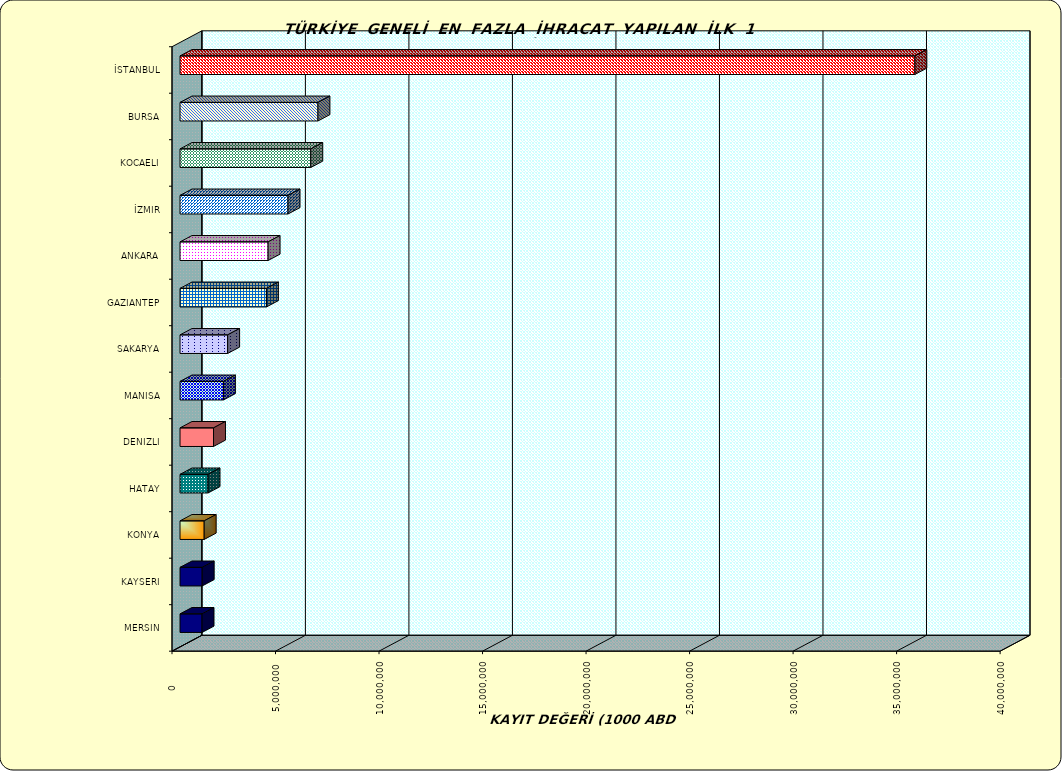
| Category | Series 0 |
|---|---|
| İSTANBUL | 35494831.676 |
| BURSA | 6662457.967 |
| KOCAELI | 6315572.159 |
| İZMIR | 5218200.332 |
| ANKARA | 4255302.462 |
| GAZIANTEP | 4174549.779 |
| SAKARYA | 2300046.669 |
| MANISA | 2096895.375 |
| DENIZLI | 1617993.827 |
| HATAY | 1353079.486 |
| KONYA | 1167530.969 |
| KAYSERI | 1069946.506 |
| MERSIN | 1063288.992 |